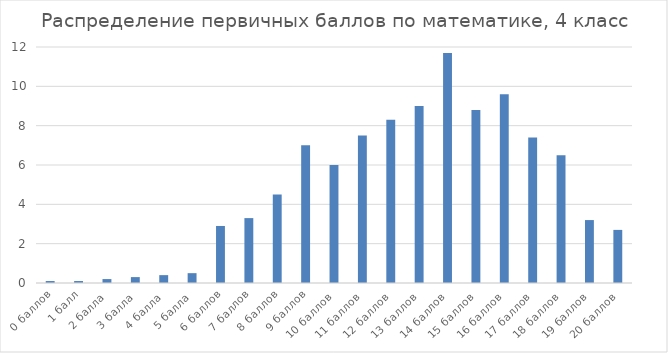
| Category | Series 0 |
|---|---|
| 0 баллов | 0.1 |
| 1 балл | 0.1 |
| 2 балла | 0.2 |
| 3 балла | 0.3 |
| 4 балла | 0.4 |
| 5 балла | 0.5 |
| 6 баллов | 2.9 |
| 7 баллов | 3.3 |
| 8 баллов | 4.5 |
| 9 баллов | 7 |
| 10 баллов | 6 |
| 11 баллов | 7.5 |
| 12 баллов | 8.3 |
| 13 баллов | 9 |
| 14 баллов | 11.7 |
| 15 баллов | 8.8 |
| 16 баллов | 9.6 |
| 17 баллов | 7.4 |
| 18 баллов | 6.5 |
| 19 баллов | 3.2 |
| 20 баллов | 2.7 |